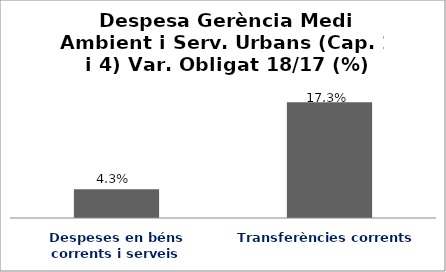
| Category | Series 0 |
|---|---|
| Despeses en béns corrents i serveis | 0.043 |
| Transferències corrents | 0.173 |